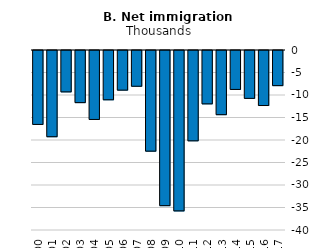
| Category | Net migration |
|---|---|
| 2000.0 | -16428 |
| 2001.0 | -19163 |
| 2002.0 | -9195 |
| 2003.0 | -11584 |
| 2004.0 | -15323 |
| 2005.0 | -10952 |
| 2006.0 | -8807 |
| 2007.0 | -7946 |
| 2008.0 | -22367 |
| 2009.0 | -34477 |
| 2010.0 | -35640 |
| 2011.0 | -20077 |
| 2012.0 | -11860 |
| 2013.0 | -14262 |
| 2014.0 | -8652 |
| 2015.0 | -10640 |
| 2016.0 | -12229 |
| 2017.0 | -7808 |